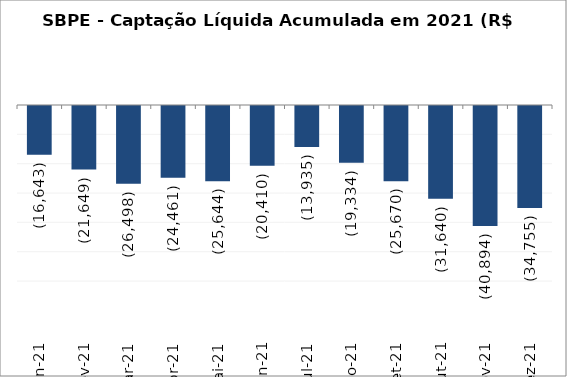
| Category | SBPE - Captação Líquida Acumulada em 2021 (R$ Milhões)  |
|---|---|
| Jan-21 | -16643.433 |
| Fev-21 | -21648.807 |
| Mar-21 | -26498.104 |
| Abr-21 | -24460.763 |
| Mai-21 | -25644.016 |
| Jun-21 | -20410.262 |
| Jul-21 | -13935.418 |
| Ago-21 | -19333.974 |
| Set-21 | -25670.378 |
| Out-21 | -31639.789 |
| Nov-21 | -40893.971 |
| Dez-21 | -34755.497 |